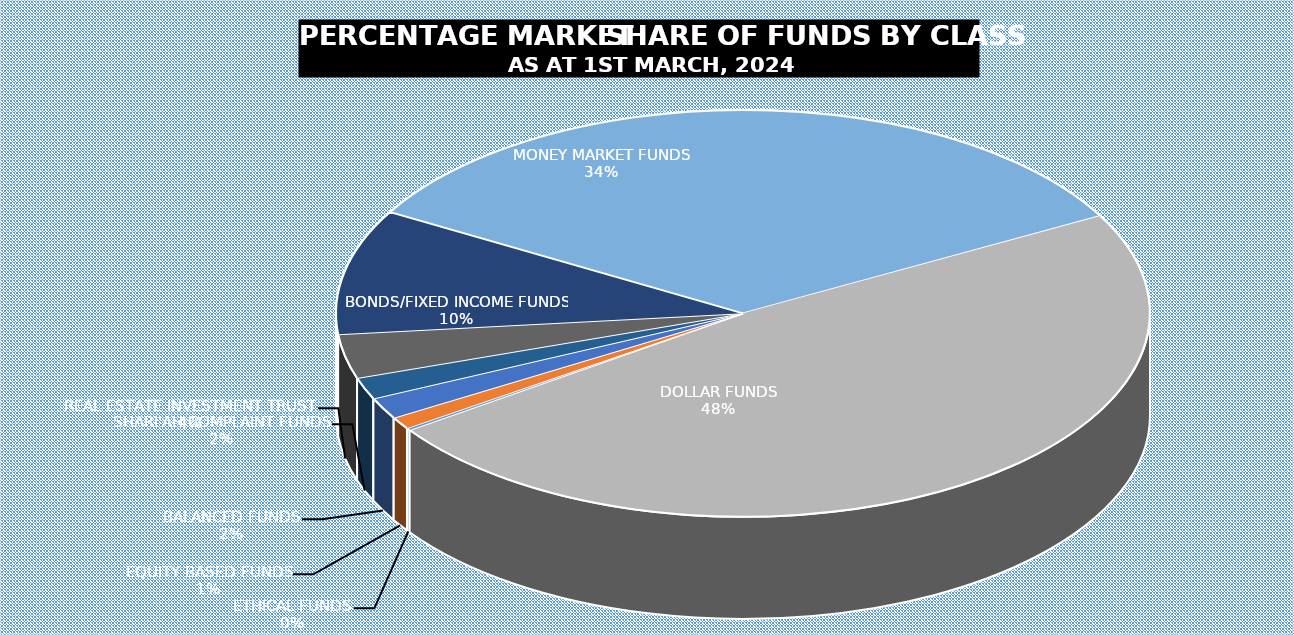
| Category | 1-Mar |
|---|---|
| ETHICAL FUNDS | 5112400375.62 |
| EQUITY BASED FUNDS | 27345380292.45 |
| BALANCED FUNDS | 48445217858.992 |
| SHARI'AH COMPLAINT FUNDS | 49267826292.25 |
| REAL ESTATE INVESTMENT TRUST | 99747815398.121 |
| BONDS/FIXED INCOME FUNDS | 282274672291.85 |
| MONEY MARKET FUNDS | 959419740927.825 |
| DOLLAR FUNDS | 1370513862524.368 |